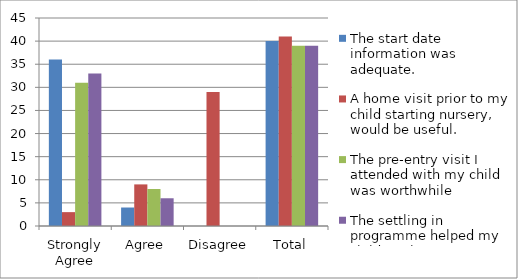
| Category | The start date information was adequate. | A home visit prior to my child starting nursery, would be useful. | The pre-entry visit I attended with my child was worthwhile | The settling in programme helped my child settle. |
|---|---|---|---|---|
| Strongly Agree | 36 | 3 | 31 | 33 |
| Agree | 4 | 9 | 8 | 6 |
| Disagree | 0 | 29 | 0 | 0 |
| Total | 40 | 41 | 39 | 39 |